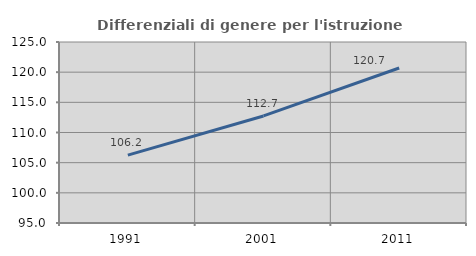
| Category | Differenziali di genere per l'istruzione superiore |
|---|---|
| 1991.0 | 106.249 |
| 2001.0 | 112.746 |
| 2011.0 | 120.692 |